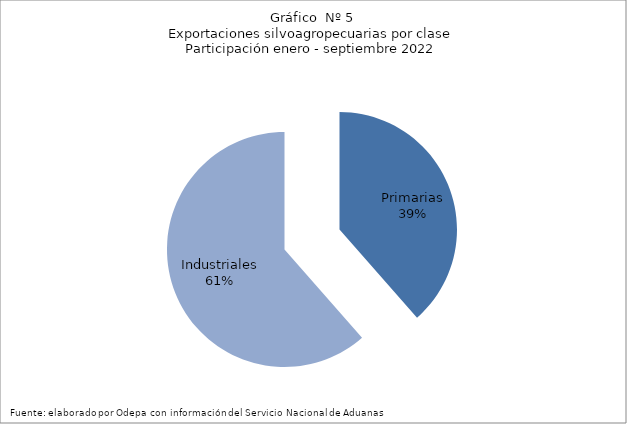
| Category | Series 0 |
|---|---|
| Primarias | 5141392 |
| Industriales | 8202462 |